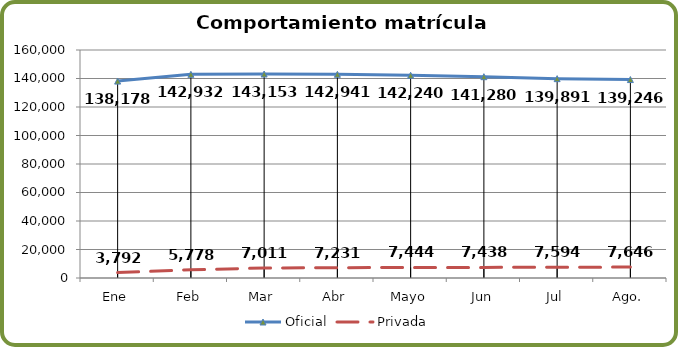
| Category | Oficial | Privada |
|---|---|---|
| Ene | 138178 | 3792 |
| Feb | 142932 | 5778 |
| Mar | 143153 | 7011 |
| Abr | 142941 | 7231 |
| Mayo | 142240 | 7444 |
| Jun | 141280 | 7438 |
| Jul | 139891 | 7594 |
| Ago. | 139246 | 7646 |